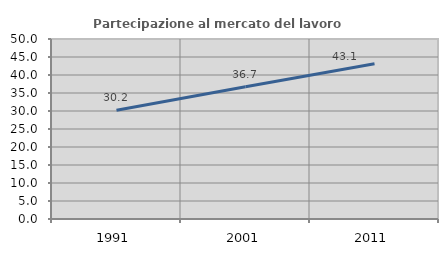
| Category | Partecipazione al mercato del lavoro  femminile |
|---|---|
| 1991.0 | 30.208 |
| 2001.0 | 36.735 |
| 2011.0 | 43.137 |